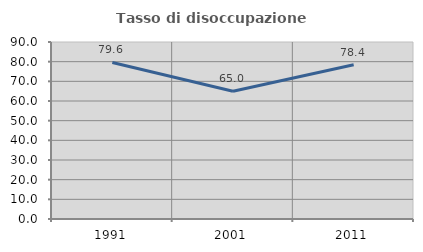
| Category | Tasso di disoccupazione giovanile  |
|---|---|
| 1991.0 | 79.612 |
| 2001.0 | 65 |
| 2011.0 | 78.431 |